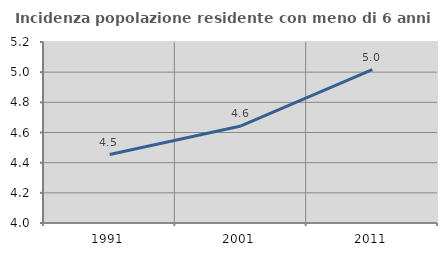
| Category | Incidenza popolazione residente con meno di 6 anni |
|---|---|
| 1991.0 | 4.454 |
| 2001.0 | 4.644 |
| 2011.0 | 5.017 |